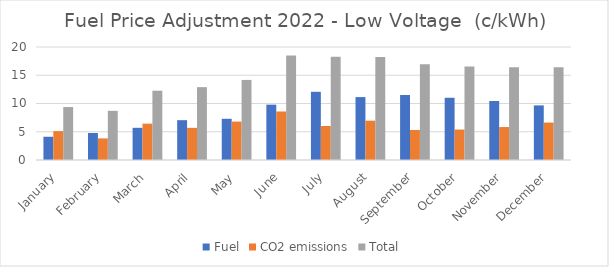
| Category | Fuel | CO2 emissions | Total |
|---|---|---|---|
| January | 4.113 | 5.111 | 9.374 |
| February | 4.777 | 3.824 | 8.702 |
| March | 5.699 | 6.436 | 12.262 |
| April | 7.048 | 5.69 | 12.896 |
| May | 7.294 | 6.802 | 14.171 |
| June | 9.796 | 8.589 | 18.513 |
| July | 12.071 | 6.015 | 18.253 |
| August | 11.134 | 6.959 | 18.22 |
| September | 11.503 | 5.314 | 16.953 |
| October | 11.015 | 5.392 | 16.551 |
| November | 10.438 | 5.835 | 16.399 |
| December | 9.666 | 6.625 | 16.41 |